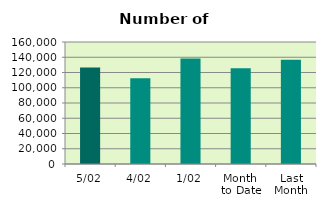
| Category | Series 0 |
|---|---|
| 5/02 | 126494 |
| 4/02 | 112450 |
| 1/02 | 138198 |
| Month 
to Date | 125714 |
| Last
Month | 136846.364 |